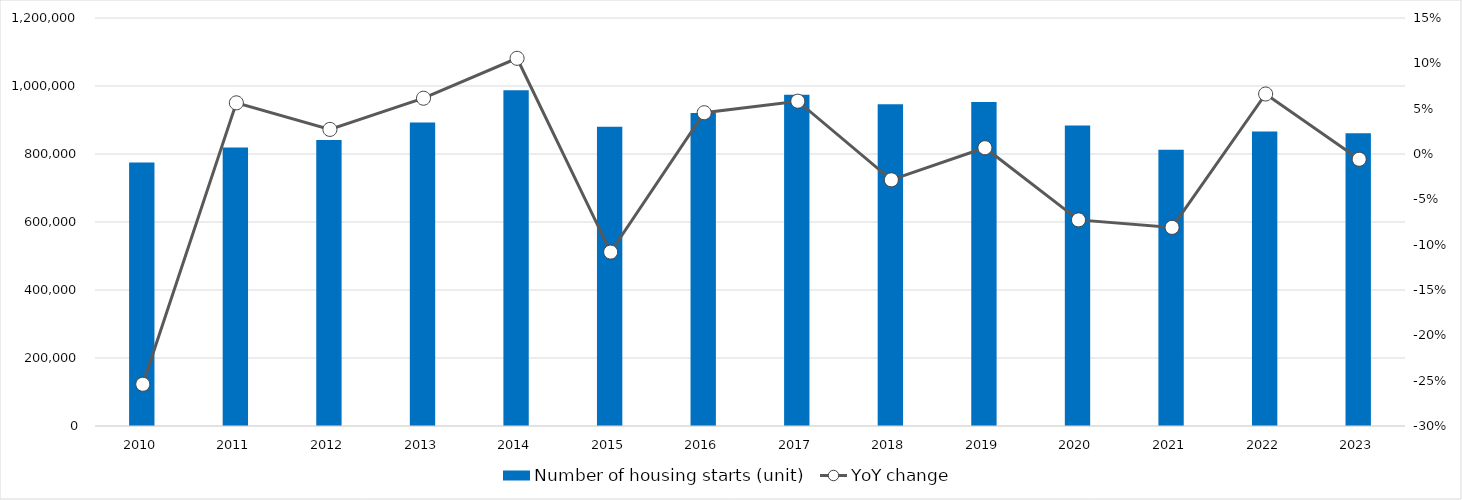
| Category | Number of housing starts (unit) |
|---|---|
| 2010 | 775277 |
| 2011 | 819020 |
| 2012 | 841246 |
| 2013 | 893002 |
| 2014 | 987254 |
| 2015 | 880470 |
| 2016 | 920537 |
| 2017 | 974137 |
| 2018 | 946396 |
| 2019 | 952936 |
| 2020 | 883687 |
| 2021 | 812164 |
| 2022 | 865909 |
| 2023 | 860828 |